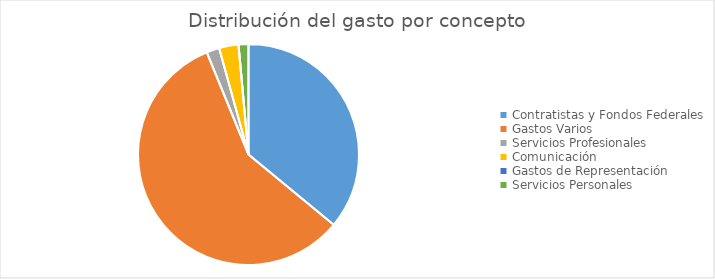
| Category | Series 0 |
|---|---|
| Contratistas y Fondos Federales | 231934908.89 |
| Gastos Varios | 372843166.07 |
| Servicios Profesionales | 12161514.19 |
| Comunicación | 18267833.01 |
| Gastos de Representación | 15153.88 |
| Servicios Personales | 9348466.18 |